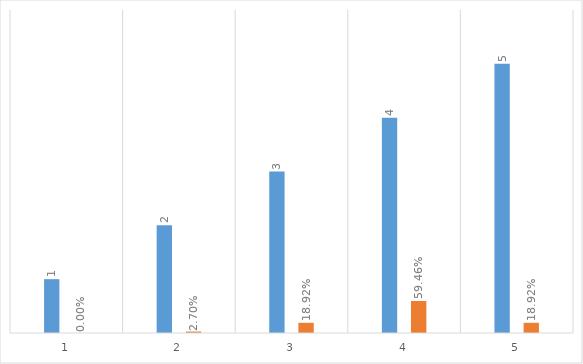
| Category | Series 0 | Series 1 |
|---|---|---|
| 0 | 1 | 0 |
| 1 | 2 | 0.027 |
| 2 | 3 | 0.189 |
| 3 | 4 | 0.595 |
| 4 | 5 | 0.189 |